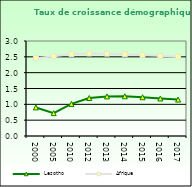
| Category | Lesotho | Afrique                        |
|---|---|---|
| 2000.0 | 0.902 | 2.458 |
| 2005.0 | 0.722 | 2.516 |
| 2010.0 | 1.014 | 2.59 |
| 2012.0 | 1.199 | 2.606 |
| 2013.0 | 1.251 | 2.601 |
| 2014.0 | 1.255 | 2.584 |
| 2015.0 | 1.224 | 2.559 |
| 2016.0 | 1.184 | 2.531 |
| 2017.0 | 1.15 | 2.503 |